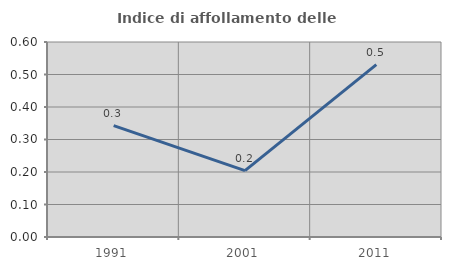
| Category | Indice di affollamento delle abitazioni  |
|---|---|
| 1991.0 | 0.343 |
| 2001.0 | 0.204 |
| 2011.0 | 0.531 |